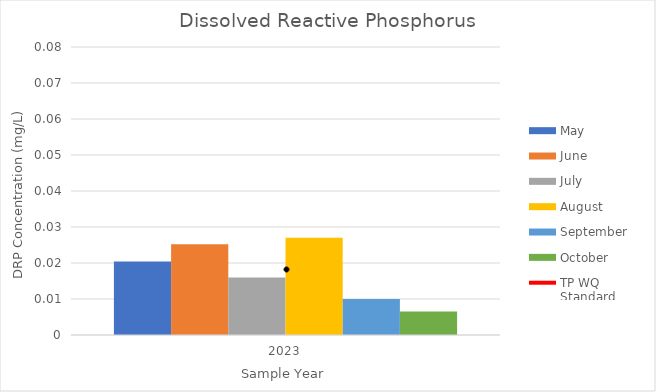
| Category | May | June | July | August | September | October |
|---|---|---|---|---|---|---|
| 2023.0 | 0.02 | 0.025 | 0.016 | 0.027 | 0.01 | 0.007 |